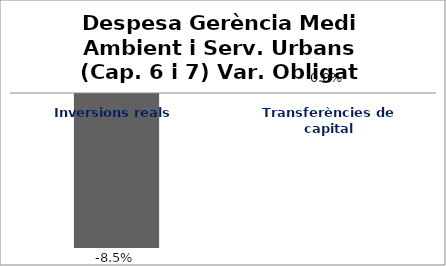
| Category | Series 0 |
|---|---|
| Inversions reals | -0.085 |
| Transferències de capital | 0 |